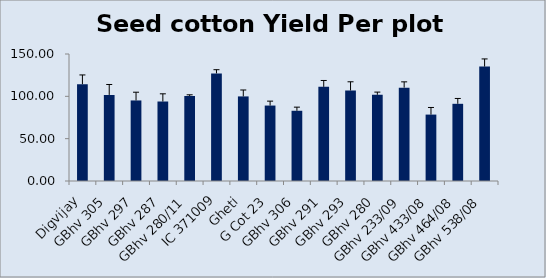
| Category | Seed cotton Yield Per plot (g) |
|---|---|
| Digvijay | 114.32 |
| GBhv 305 | 101.665 |
| GBhv 297 | 95.14 |
| GBhv 287 | 93.89 |
| GBhv 280/11 | 100.385 |
| IC 371009 | 127.1 |
| Gheti | 99.9 |
| G Cot 23 | 89.105 |
| GBhv 306 | 82.95 |
| GBhv 291 | 111.225 |
| GBhv 293 | 106.95 |
| GBhv 280 | 101.845 |
| GBhv 233/09 | 110.285 |
| GBhv 433/08 | 78.435 |
| GBhv 464/08 | 91.17 |
| GBhv 538/08 | 135.18 |